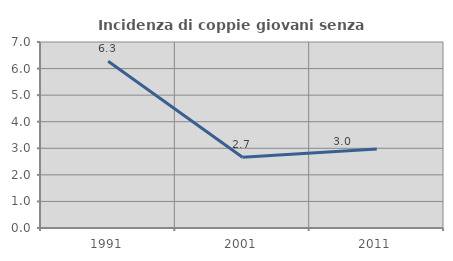
| Category | Incidenza di coppie giovani senza figli |
|---|---|
| 1991.0 | 6.278 |
| 2001.0 | 2.66 |
| 2011.0 | 2.976 |